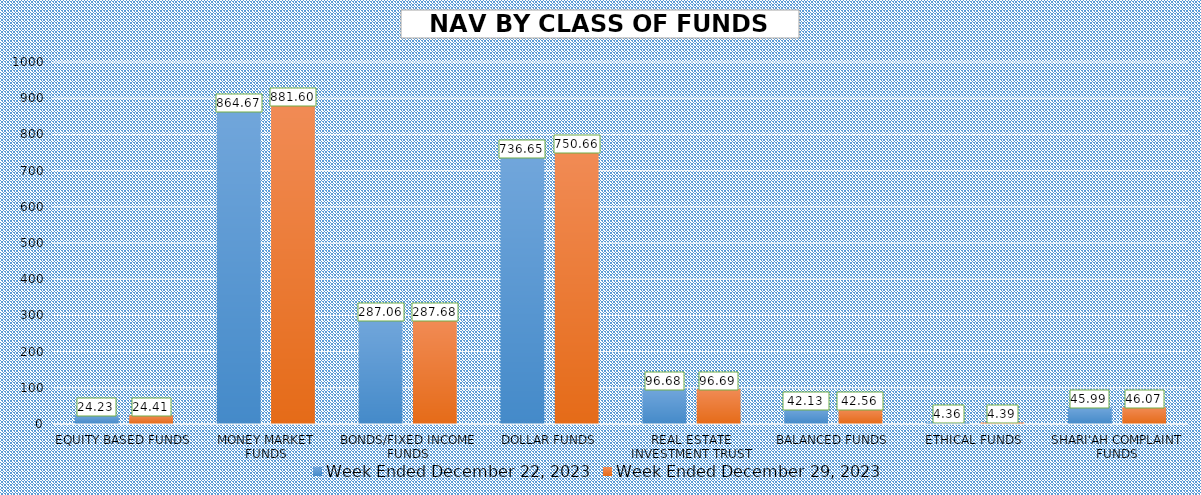
| Category | Week Ended December 22, 2023 | Week Ended December 29, 2023 |
|---|---|---|
| EQUITY BASED FUNDS | 24.23 | 24.405 |
| MONEY MARKET FUNDS | 864.67 | 881.603 |
| BONDS/FIXED INCOME FUNDS | 287.058 | 287.675 |
| DOLLAR FUNDS | 736.655 | 750.658 |
| REAL ESTATE INVESTMENT TRUST | 96.679 | 96.686 |
| BALANCED FUNDS | 42.134 | 42.556 |
| ETHICAL FUNDS | 4.362 | 4.392 |
| SHARI'AH COMPLAINT FUNDS | 45.994 | 46.069 |